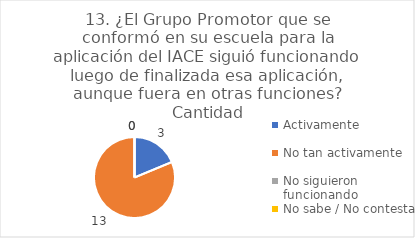
| Category | 13. ¿El Grupo Promotor que se conformó en su escuela para la aplicación del IACE siguió funcionando luego de finalizada esa aplicación, aunque fuera en otras funciones? |
|---|---|
| Activamente  | 0.188 |
| No tan activamente  | 0.812 |
| No siguieron funcionando  | 0 |
| No sabe / No contesta | 0 |